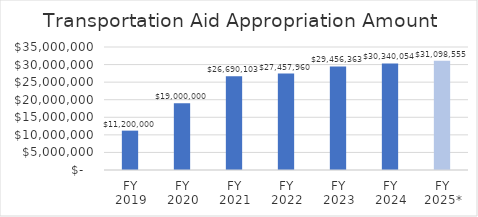
| Category | Transportation Aid Appropriation Amount |
|---|---|
| FY 2019 | 11200000 |
| FY 2020 | 19000000 |
| FY 2021 | 26690103 |
| FY 2022 | 27457960 |
| FY 2023 | 29456363.088 |
| FY 2024 | 30340053.981 |
| FY 2025* | 31098555.33 |